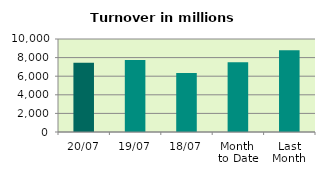
| Category | Series 0 |
|---|---|
| 20/07 | 7448.7 |
| 19/07 | 7739.632 |
| 18/07 | 6354.427 |
| Month 
to Date | 7507.702 |
| Last
Month | 8790.45 |